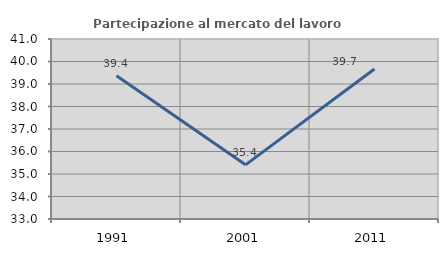
| Category | Partecipazione al mercato del lavoro  femminile |
|---|---|
| 1991.0 | 39.366 |
| 2001.0 | 35.406 |
| 2011.0 | 39.669 |